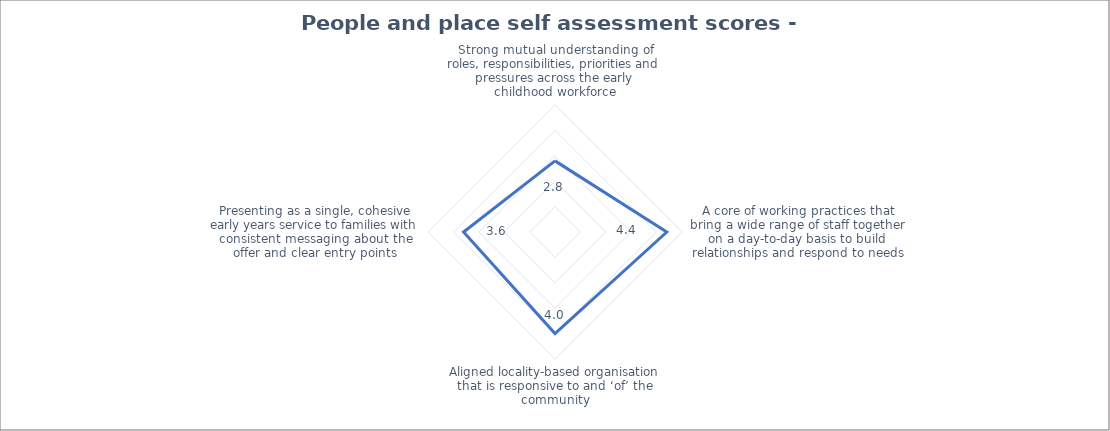
| Category | Series 0 |
|---|---|
| Strong mutual understanding of roles, responsibilities, priorities and pressures across the early childhood workforce | 2.8 |
| A core of working practices that bring a wide range of staff together on a day-to-day basis to build relationships and respond to needs | 4.4 |
| Aligned locality-based organisation that is responsive to and ‘of’ the community | 4 |
| Presenting as a single, cohesive early years service to families with consistent messaging about the offer and clear entry points | 3.6 |